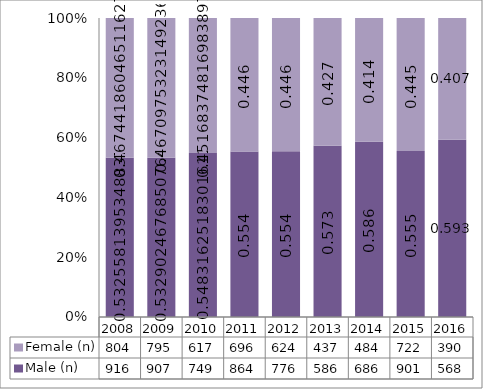
| Category | Male (n) | Female (n) |
|---|---|---|
| 2008.0 | 916 | 804 |
| 2009.0 | 907 | 795 |
| 2010.0 | 749 | 617 |
| 2011.0 | 864 | 696 |
| 2012.0 | 776 | 624 |
| 2013.0 | 586 | 437 |
| 2014.0 | 686 | 484 |
| 2015.0 | 901 | 722 |
| 2016.0 | 568 | 390 |